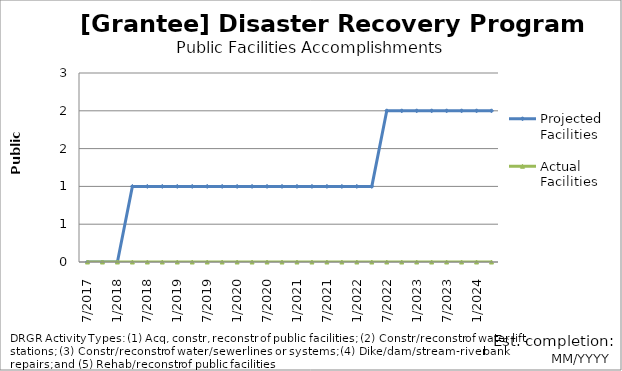
| Category | Projected Facilities | Actual Facilities |
|---|---|---|
| 7/2017 | 0 | 0 |
| 10/2017 | 0 | 0 |
| 1/2018 | 0 | 0 |
| 4/2018 | 1 | 0 |
| 7/2018 | 1 | 0 |
| 10/2018 | 1 | 0 |
| 1/2019 | 1 | 0 |
| 4/2019 | 1 | 0 |
| 7/2019 | 1 | 0 |
| 10/2019 | 1 | 0 |
| 1/2020 | 1 | 0 |
| 4/2020 | 1 | 0 |
| 7/2020 | 1 | 0 |
| 10/2020 | 1 | 0 |
| 1/2021 | 1 | 0 |
| 4/2021 | 1 | 0 |
| 7/2021 | 1 | 0 |
| 10/2021 | 1 | 0 |
| 1/2022 | 1 | 0 |
| 4/2022 | 1 | 0 |
| 7/2022 | 2 | 0 |
| 10/2022 | 2 | 0 |
| 1/2023 | 2 | 0 |
| 4/2023 | 2 | 0 |
| 7/2023 | 2 | 0 |
| 10/2023 | 2 | 0 |
| 1/2024 | 2 | 0 |
| 4/2024 | 2 | 0 |